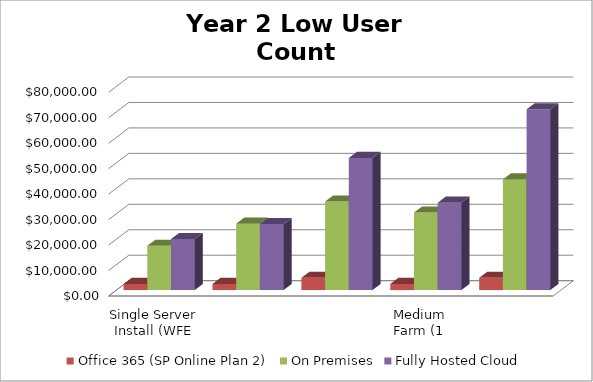
| Category | Office 365 (SP Online Plan 2) | On Premises | Fully Hosted Cloud |
|---|---|---|---|
| Single Server Install (WFE and SQL on 1 VM) | 2400 | 17390.604 | 20040 |
| Small Farm - Two Server Install (WFE and SQL) | 2400 | 26085.906 | 25920 |
| Small Farm w/ High Availability (2 WFE - 2 SQL) | 4800 | 34781.208 | 51900 |
| Medium Farm (1 WFE, 1 App/Index, 1 SQL) | 2400 | 30433.557 | 34320 |
| Medium Farm w/ High Availability (2 WFE, 2 A/I, 2 SQL) | 4800 | 43476.51 | 70980 |